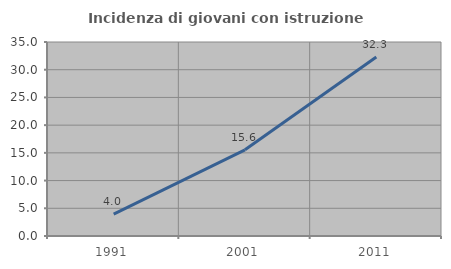
| Category | Incidenza di giovani con istruzione universitaria |
|---|---|
| 1991.0 | 3.96 |
| 2001.0 | 15.556 |
| 2011.0 | 32.292 |